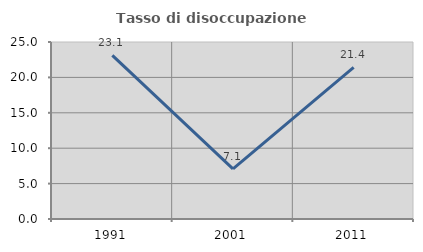
| Category | Tasso di disoccupazione giovanile  |
|---|---|
| 1991.0 | 23.113 |
| 2001.0 | 7.092 |
| 2011.0 | 21.429 |